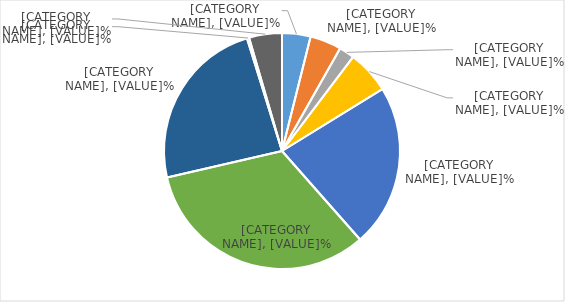
| Category | % |
|---|---|
| Dry seasonal forest | 3.9 |
| Woodland | 4.3 |
| Savannah | 2.1 |
| Swamp forest | 5.9 |
| Lower montane forest | 22.3 |
| Low altitude forest on uplands | 32.9 |
| Low altitude forest on plains and fans | 23.8 |
| Plantation forest | 0.3 |
| Other | 4.5 |